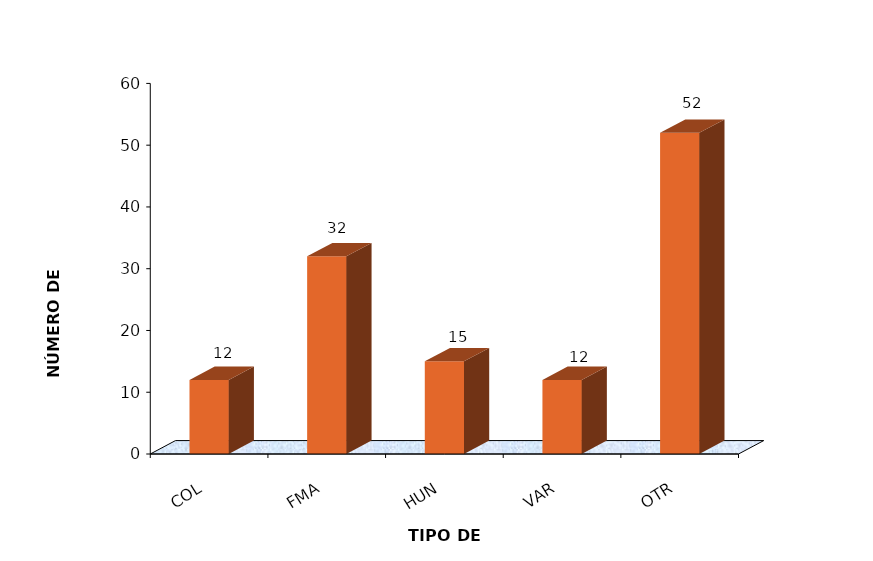
| Category | Series 0 |
|---|---|
| COL | 12 |
| FMA | 32 |
| HUN | 15 |
| VAR | 12 |
| OTR | 52 |